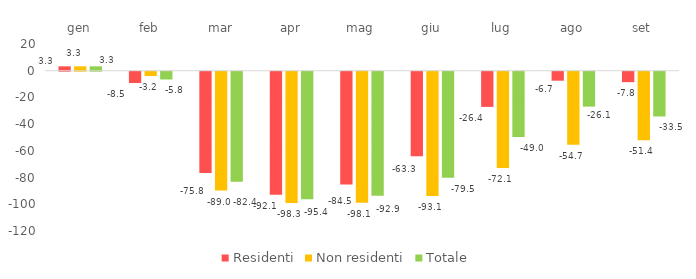
| Category | Residenti | Non residenti | Totale |
|---|---|---|---|
| gen | 3.294 | 3.283 | 3.289 |
| feb | -8.456 | -3.188 | -5.806 |
| mar | -75.773 | -89.01 | -82.367 |
| apr | -92.051 | -98.267 | -95.412 |
| mag | -84.527 | -98.097 | -92.88 |
| giu | -63.305 | -93.053 | -79.47 |
| lug | -26.352 | -72.11 | -48.959 |
| ago | -6.721 | -54.696 | -26.131 |
| set | -7.838 | -51.379 | -33.515 |